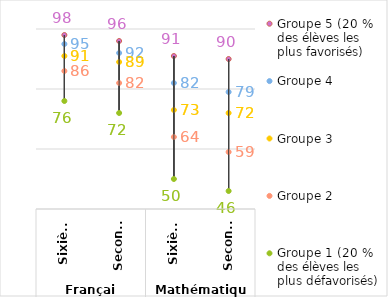
| Category | Groupe 5 (20 % des élèves les plus favorisés) | Groupe 4 | Groupe 3 | Groupe 2 | Groupe 1 (20 % des élèves les plus défavorisés) |
|---|---|---|---|---|---|
| 0 | 98 | 95 | 91 | 86 | 76 |
| 1 | 96 | 92 | 89 | 82 | 72 |
| 2 | 91 | 82 | 73 | 64 | 50 |
| 3 | 90 | 79 | 72 | 59 | 46 |